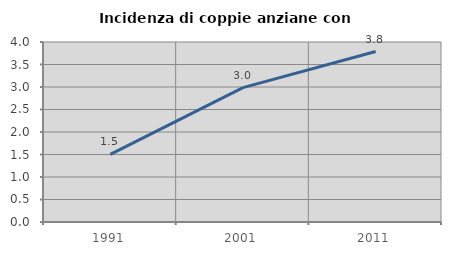
| Category | Incidenza di coppie anziane con figli |
|---|---|
| 1991.0 | 1.502 |
| 2001.0 | 2.987 |
| 2011.0 | 3.788 |